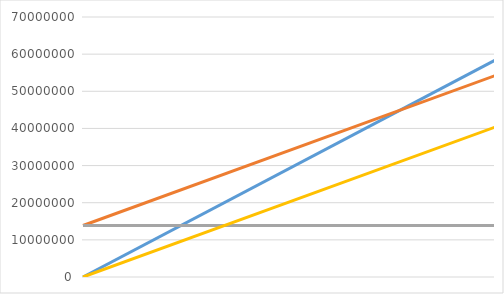
| Category | I x V | CT | CF | CV |
|---|---|---|---|---|
| 0.0 | 0 | 13862946.294 | 13862946.294 | 0 |
| 40257.0 | 58372650 | 54211085.922 | 13862946.294 | 40348139.628 |